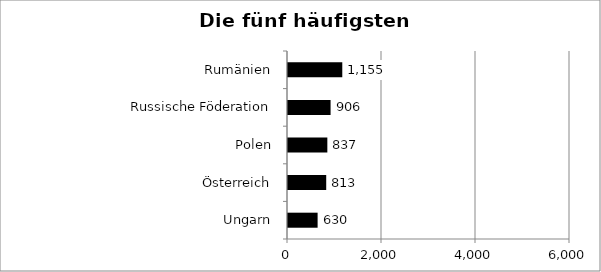
| Category | Series 0 |
|---|---|
| Ungarn | 630 |
| Österreich | 813 |
| Polen | 837 |
| Russische Föderation | 906 |
| Rumänien | 1155 |